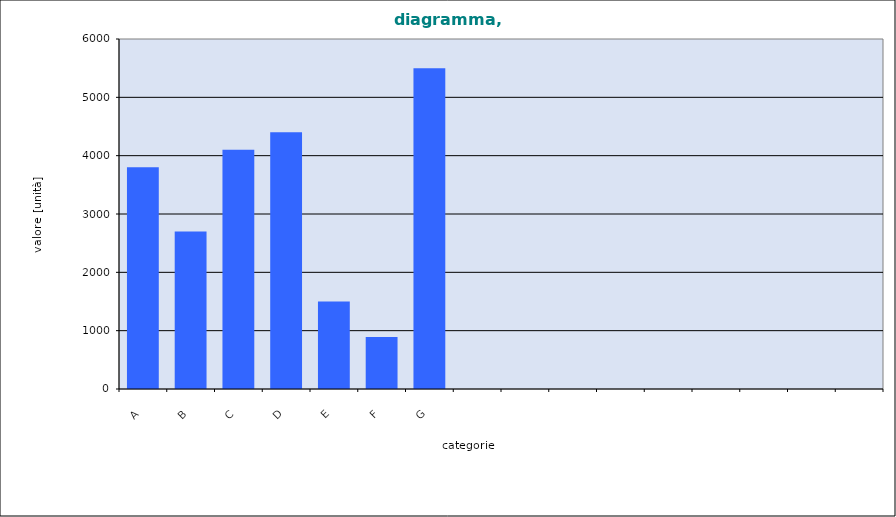
| Category | diagramma, titolo |
|---|---|
| A | 3800 |
| B | 2700 |
| C | 4100 |
| D | 4400 |
| E | 1500 |
| F | 890 |
| G | 5500 |